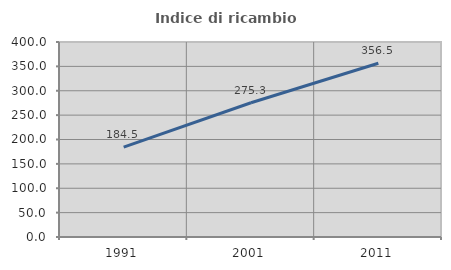
| Category | Indice di ricambio occupazionale  |
|---|---|
| 1991.0 | 184.502 |
| 2001.0 | 275.309 |
| 2011.0 | 356.466 |